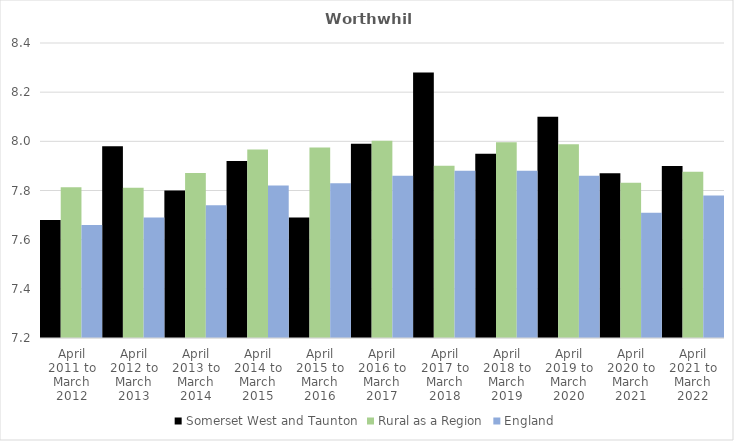
| Category | Somerset West and Taunton | Rural as a Region | England |
|---|---|---|---|
| April 2011 to March 2012 | 7.68 | 7.813 | 7.66 |
| April 2012 to March 2013 | 7.98 | 7.811 | 7.69 |
| April 2013 to March 2014 | 7.8 | 7.871 | 7.74 |
| April 2014 to March 2015 | 7.92 | 7.967 | 7.82 |
| April 2015 to March 2016 | 7.69 | 7.975 | 7.83 |
| April 2016 to March 2017 | 7.99 | 8.002 | 7.86 |
| April 2017 to March 2018 | 8.28 | 7.9 | 7.88 |
| April 2018 to March 2019 | 7.95 | 7.996 | 7.88 |
| April 2019 to March 2020 | 8.1 | 7.988 | 7.86 |
| April 2020 to March 2021 | 7.87 | 7.831 | 7.71 |
| April 2021 to March 2022 | 7.9 | 7.877 | 7.78 |